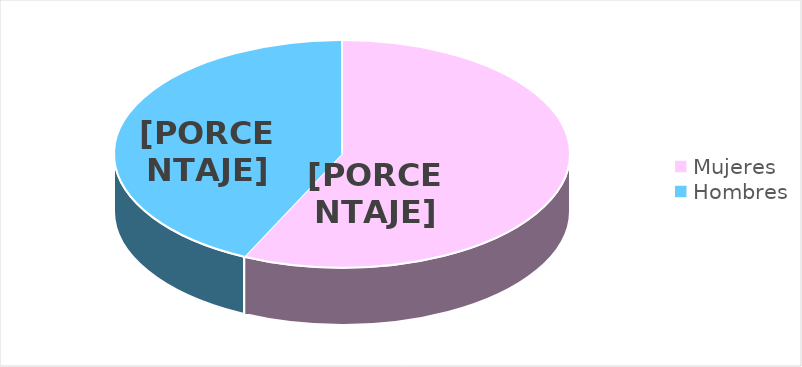
| Category | Series 0 |
|---|---|
| Mujeres | 2594 |
| Hombres | 1953 |